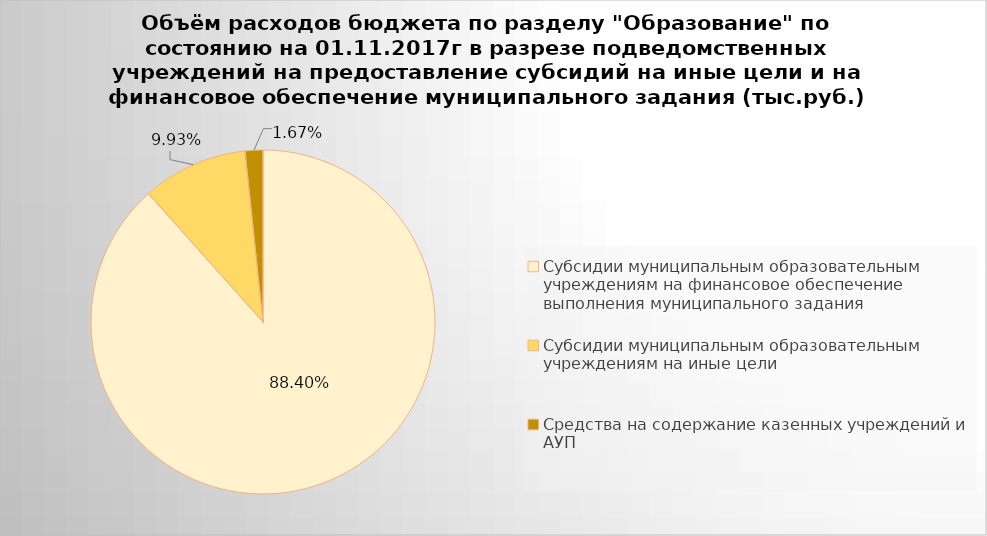
| Category | Series 0 |
|---|---|
| Субсидии муниципальным образовательным учреждениям на финансовое обеспечение выполнения муниципального задания | 4723215.72 |
| Субсидии муниципальным образовательным учреждениям на иные цели | 530335.88 |
| Средства на содержание казенных учреждений и АУП | 89200.38 |